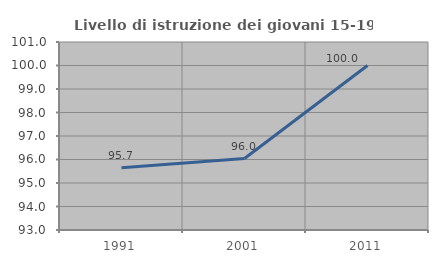
| Category | Livello di istruzione dei giovani 15-19 anni |
|---|---|
| 1991.0 | 95.652 |
| 2001.0 | 96.04 |
| 2011.0 | 100 |